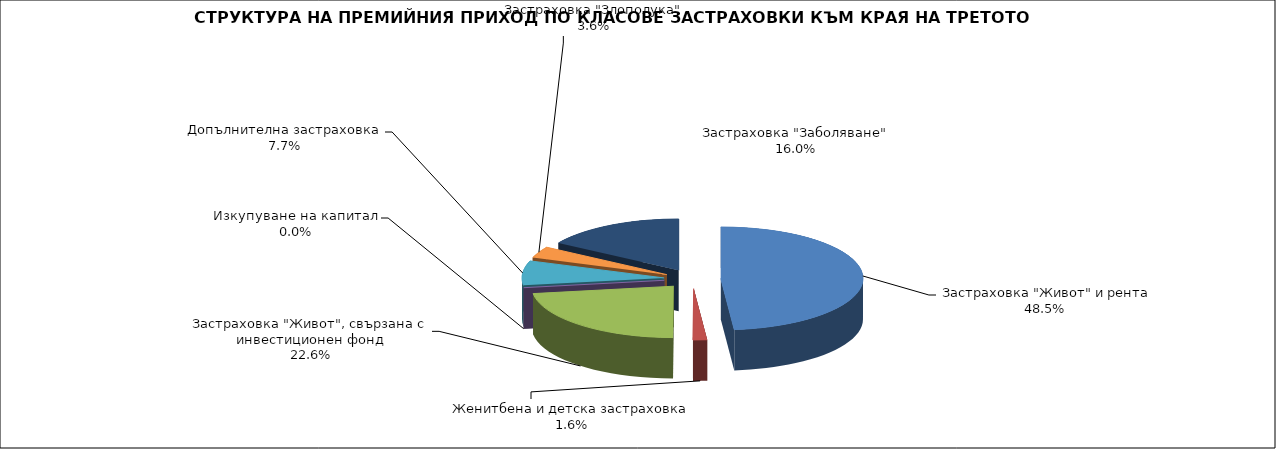
| Category |  Застраховка "Живот" и рента |
|---|---|
|  Застраховка "Живот" и рента | 158715253.217 |
| Женитбена и детска застраховка | 5215692.035 |
| Застраховка "Живот", свързана с инвестиционен фонд | 73998509.327 |
| Изкупуване на капитал | 0 |
| Допълнителна застраховка | 25151408.514 |
| Застраховка "Злополука" | 11730711.89 |
| Застраховка "Заболяване" | 52491306.39 |